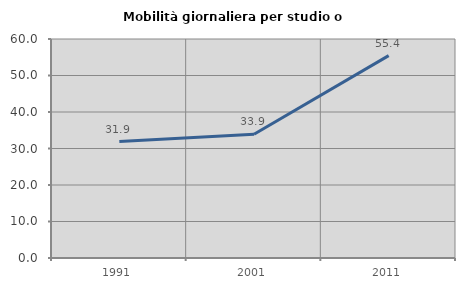
| Category | Mobilità giornaliera per studio o lavoro |
|---|---|
| 1991.0 | 31.886 |
| 2001.0 | 33.907 |
| 2011.0 | 55.447 |